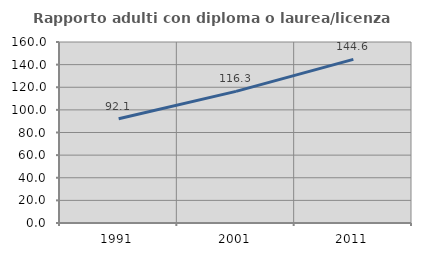
| Category | Rapporto adulti con diploma o laurea/licenza media  |
|---|---|
| 1991.0 | 92.079 |
| 2001.0 | 116.341 |
| 2011.0 | 144.626 |